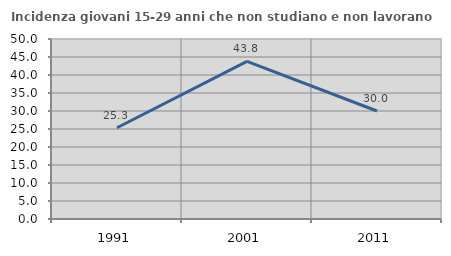
| Category | Incidenza giovani 15-29 anni che non studiano e non lavorano  |
|---|---|
| 1991.0 | 25.347 |
| 2001.0 | 43.762 |
| 2011.0 | 30 |